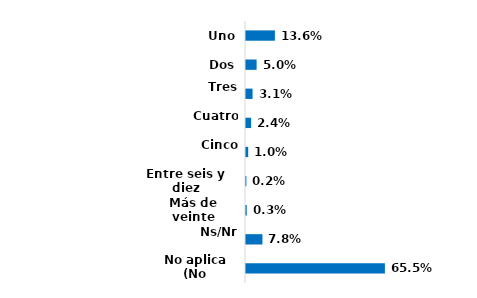
| Category | Series 0 |
|---|---|
| Uno | 0.136 |
| Dos | 0.05 |
| Tres | 0.031 |
| Cuatro | 0.024 |
| Cinco | 0.01 |
| Entre seis y diez | 0.002 |
| Más de veinte | 0.003 |
| Ns/Nr | 0.078 |
| No aplica (No reconoce a ninguno) | 0.655 |